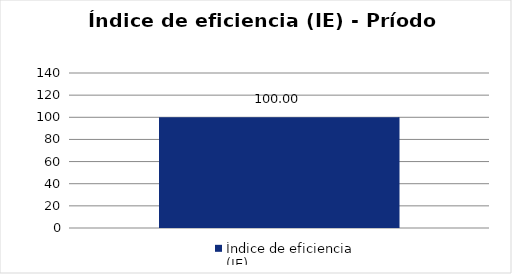
| Category | Índice de eficiencia (IE)  |
|---|---|
| Total Programa | 100 |